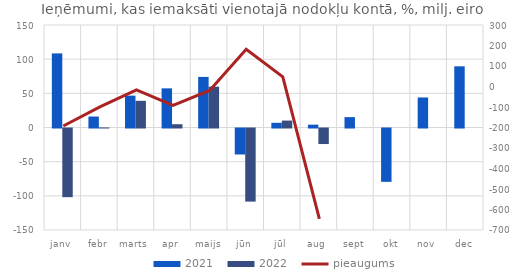
| Category | 2021 | 2022 |
|---|---|---|
| janv | 108.445 | -100.506 |
| febr | 16.011 | 0.095 |
| marts | 46.653 | 39.035 |
| apr | 57.285 | 4.799 |
| maijs | 74.045 | 59.771 |
| jūn | -38.022 | -106.986 |
| jūl | 6.867 | 10.122 |
| aug | 4.165 | -22.738 |
| sept | 15.175 | 0 |
| okt | -78.062 | 0 |
| nov | 43.919 | 0 |
| dec | 89.553 | 0 |